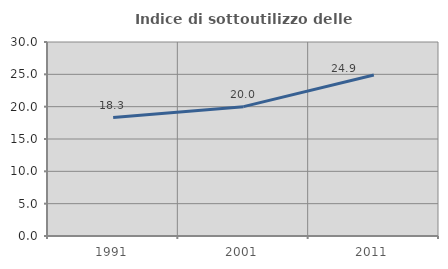
| Category | Indice di sottoutilizzo delle abitazioni  |
|---|---|
| 1991.0 | 18.316 |
| 2001.0 | 20 |
| 2011.0 | 24.89 |